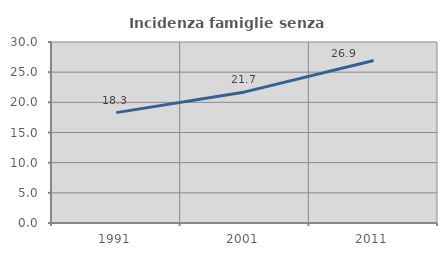
| Category | Incidenza famiglie senza nuclei |
|---|---|
| 1991.0 | 18.295 |
| 2001.0 | 21.729 |
| 2011.0 | 26.923 |